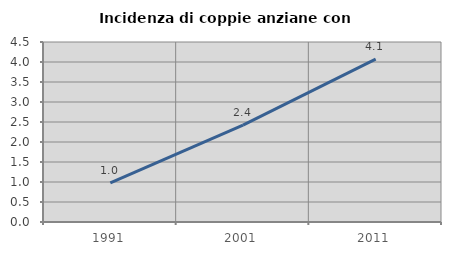
| Category | Incidenza di coppie anziane con figli |
|---|---|
| 1991.0 | 0.98 |
| 2001.0 | 2.422 |
| 2011.0 | 4.074 |